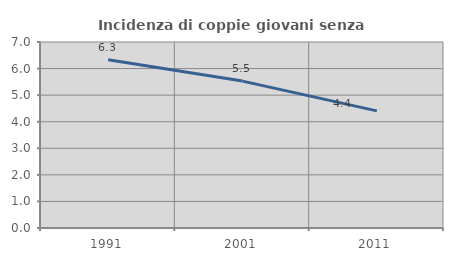
| Category | Incidenza di coppie giovani senza figli |
|---|---|
| 1991.0 | 6.331 |
| 2001.0 | 5.528 |
| 2011.0 | 4.409 |